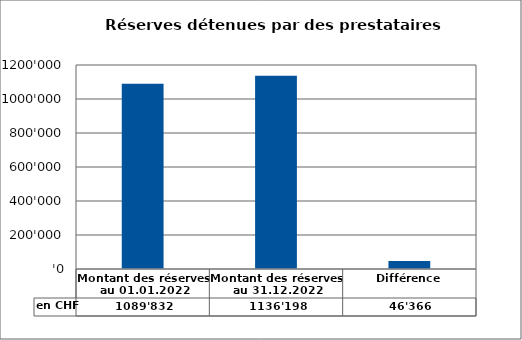
| Category | en CHF |
|---|---|
| Montant des réserves au 01.01.2022 | 1089832 |
| Montant des réserves au 31.12.2022 | 1136198 |
| Différence | 46366 |